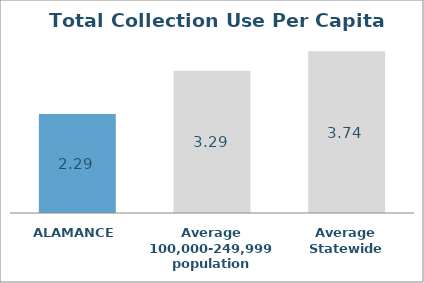
| Category | Series 0 |
|---|---|
| ALAMANCE | 2.291 |
| Average 100,000-249,999 population | 3.289 |
| Average Statewide | 3.739 |